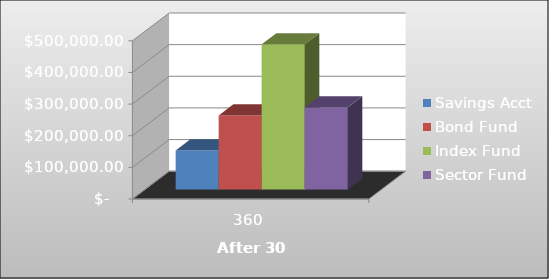
| Category | Savings Acct | Bond Fund | Index Fund | Sector Fund |
|---|---|---|---|---|
| 360.0 | 123539.834 | 234293.473 | 459036.382 | 259526.842 |